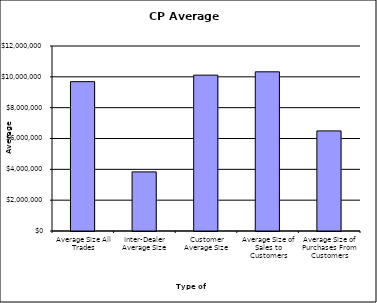
| Category | Security Type |
|---|---|
| Average Size All Trades | 9686806.73 |
| Inter-Dealer Average Size | 3833602.564 |
| Customer Average Size | 10109147.086 |
| Average Size of Sales to Customers | 10325390.196 |
| Average Size of Purchases From Customers | 6493278.689 |